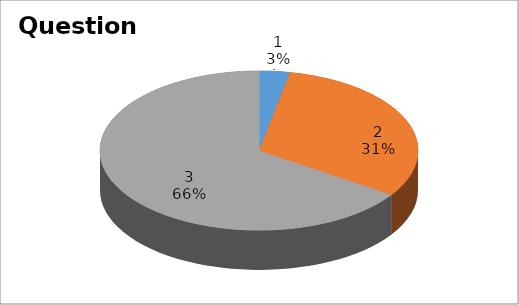
| Category | Series 0 |
|---|---|
| 0 | 1 |
| 1 | 10 |
| 2 | 21 |